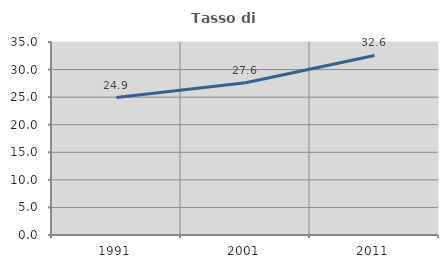
| Category | Tasso di occupazione   |
|---|---|
| 1991.0 | 24.917 |
| 2001.0 | 27.598 |
| 2011.0 | 32.561 |